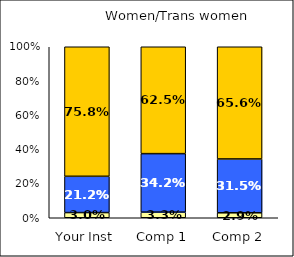
| Category | Low Civic Minded Values | Average Civic Minded Values | High Civic Minded Values |
|---|---|---|---|
| Your Inst | 0.03 | 0.212 | 0.758 |
| Comp 1 | 0.033 | 0.342 | 0.625 |
| Comp 2 | 0.029 | 0.315 | 0.656 |